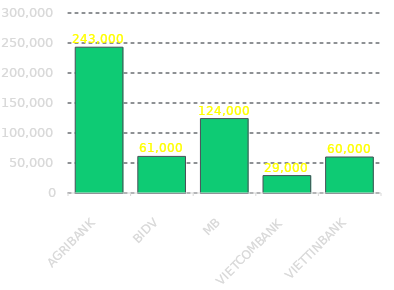
| Category | Series 0 |
|---|---|
| AGRIBANK | 243000 |
| BIDV | 61000 |
| MB | 124000 |
| VIETCOMBANK | 29000 |
| VIETTINBANK | 60000 |